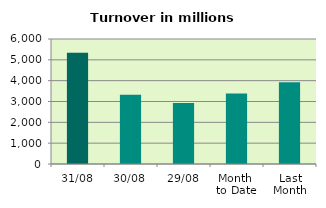
| Category | Series 0 |
|---|---|
| 31/08 | 5345.107 |
| 30/08 | 3329.253 |
| 29/08 | 2923.398 |
| Month 
to Date | 3384.596 |
| Last
Month | 3920.999 |